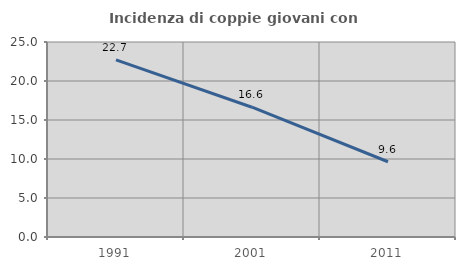
| Category | Incidenza di coppie giovani con figli |
|---|---|
| 1991.0 | 22.699 |
| 2001.0 | 16.639 |
| 2011.0 | 9.645 |